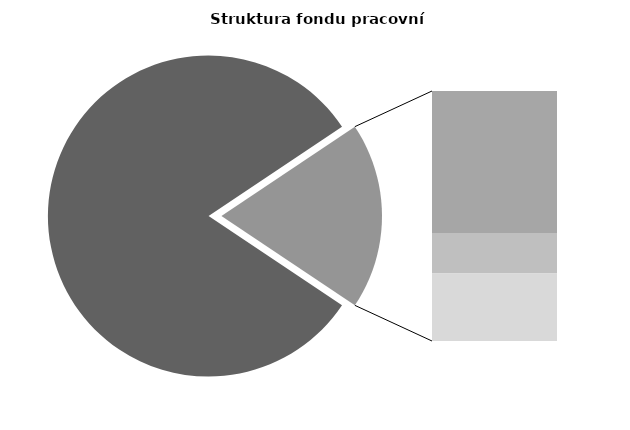
| Category | Series 0 |
|---|---|
| Průměrná měsíční odpracovaná doba bez přesčasu | 139.141 |
| Dovolená | 18.261 |
| Nemoc | 5.231 |
| Jiné | 8.679 |